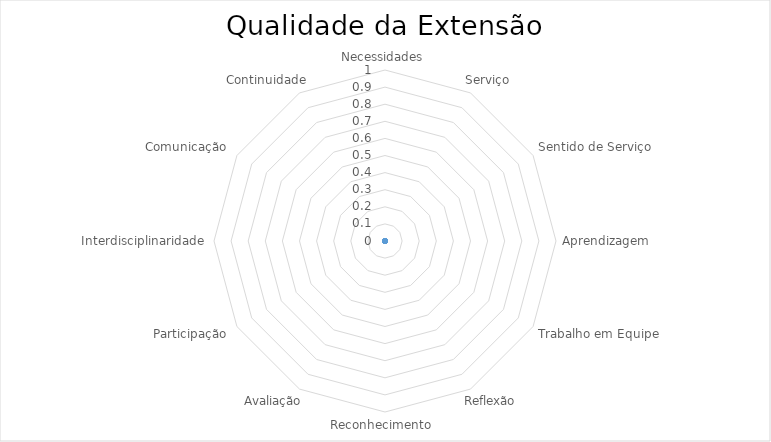
| Category | Series 0 |
|---|---|
| Necessidades | 0 |
| Serviço | 0 |
| Sentido de Serviço | 0 |
| Aprendizagem | 0 |
| Trabalho em Equipe | 0 |
| Reflexão | 0 |
| Reconhecimento  | 0 |
| Avaliação | 0 |
| Participação | 0 |
| Interdisciplinaridade | 0 |
| Comunicação | 0 |
| Continuidade | 0 |